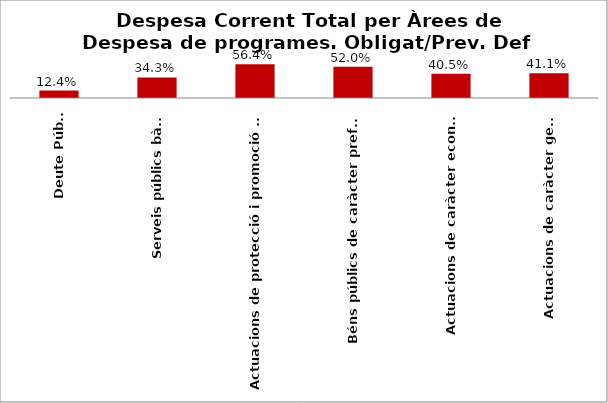
| Category | Series 0 |
|---|---|
| Deute Públic | 0.124 |
| Serveis públics bàsics | 0.343 |
| Actuacions de protecció i promoció social | 0.564 |
| Béns públics de caràcter preferent | 0.52 |
| Actuacions de caràcter econòmic | 0.405 |
| Actuacions de caràcter general | 0.411 |